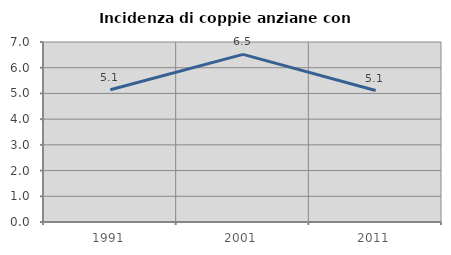
| Category | Incidenza di coppie anziane con figli |
|---|---|
| 1991.0 | 5.14 |
| 2001.0 | 6.519 |
| 2011.0 | 5.112 |